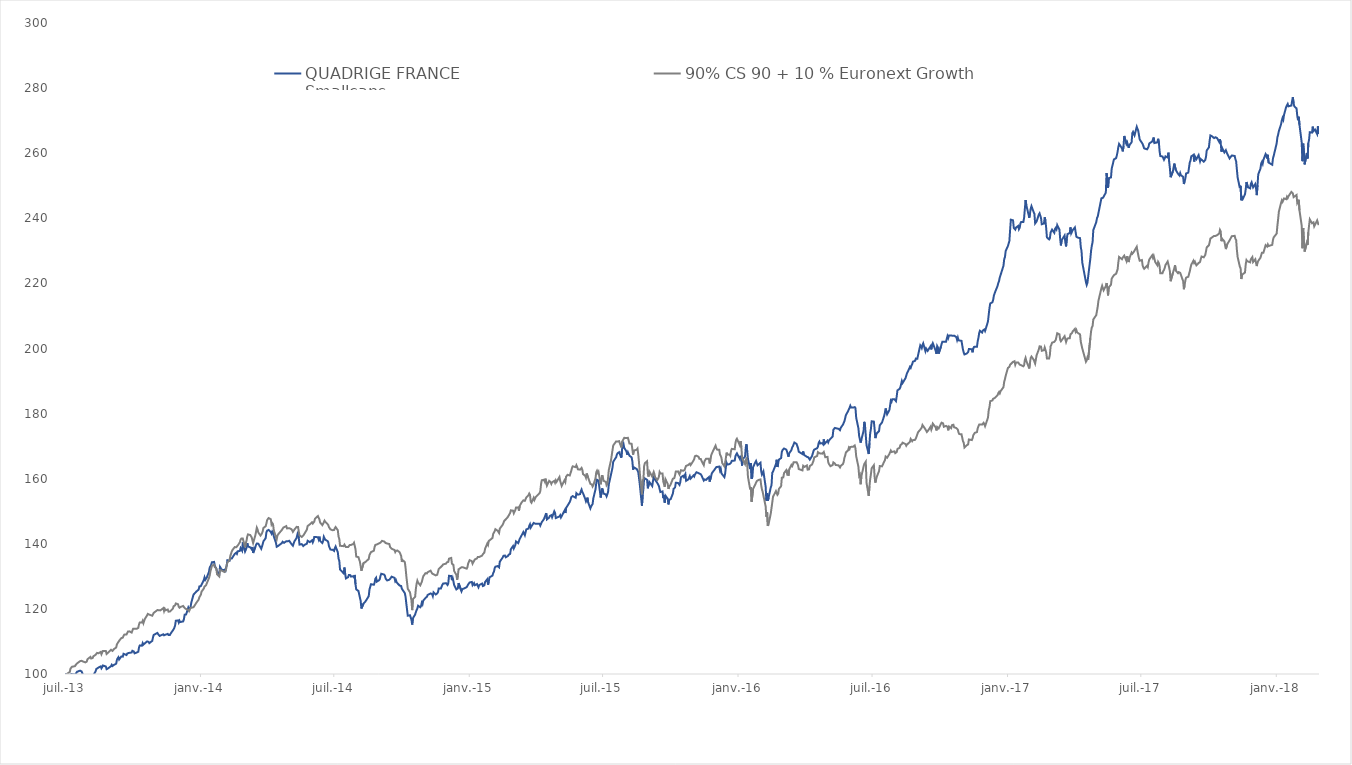
| Category |  QUADRIGE FRANCE
Smallcaps  |  90% CS 90 + 10 % Euronext Growth  |
|---|---|---|
| 2013-07-02 | 100 | 100 |
| 2013-07-03 | 100 | 99.527 |
| 2013-07-04 | 100 | 100.004 |
| 2013-07-05 | 100 | 100.1 |
| 2013-07-08 | 99.67 | 100.628 |
| 2013-07-09 | 99.74 | 101.683 |
| 2013-07-10 | 99.98 | 101.883 |
| 2013-07-11 | 100.09 | 102.224 |
| 2013-07-12 | 99.94 | 102.246 |
| 2013-07-15 | 99.78 | 102.405 |
| 2013-07-16 | 100.08 | 102.771 |
| 2013-07-17 | 100.35 | 102.888 |
| 2013-07-18 | 100.7 | 103.278 |
| 2013-07-19 | 100.81 | 103.387 |
| 2013-07-22 | 101.04 | 103.96 |
| 2013-07-23 | 101.19 | 104.056 |
| 2013-07-24 | 100.8 | 104.05 |
| 2013-07-25 | 100.83 | 104.173 |
| 2013-07-26 | 99.68 | 103.847 |
| 2013-07-29 | 99.56 | 103.564 |
| 2013-07-30 | 99.83 | 103.442 |
| 2013-07-31 | 99.26 | 103.801 |
| 2013-08-01 | 99.45 | 104.529 |
| 2013-08-02 | 99.39 | 104.623 |
| 2013-08-05 | 99.5 | 105.255 |
| 2013-08-06 | 99.4 | 104.771 |
| 2013-08-07 | 99.12 | 104.736 |
| 2013-08-08 | 98.98 | 104.891 |
| 2013-08-09 | 99.61 | 105.426 |
| 2013-08-12 | 100.8 | 105.894 |
| 2013-08-13 | 101.54 | 106.092 |
| 2013-08-14 | 101.75 | 106.475 |
| 2013-08-16 | 101.98 | 106.371 |
| 2013-08-19 | 102.33 | 106.782 |
| 2013-08-20 | 101.74 | 106.075 |
| 2013-08-21 | 102.09 | 106.605 |
| 2013-08-22 | 102.61 | 107.067 |
| 2013-08-23 | 102.81 | 107.349 |
| 2013-08-26 | 102.3 | 107.048 |
| 2013-08-27 | 101.48 | 106.151 |
| 2013-08-28 | 101.39 | 105.879 |
| 2013-08-29 | 101.72 | 106.578 |
| 2013-08-30 | 101.7 | 106.776 |
| 2013-09-02 | 102.41 | 107.444 |
| 2013-09-03 | 102.83 | 107.382 |
| 2013-09-04 | 102.46 | 107.085 |
| 2013-09-05 | 102.72 | 107.311 |
| 2013-09-06 | 102.81 | 107.668 |
| 2013-09-09 | 103.16 | 108.131 |
| 2013-09-10 | 104.36 | 109.126 |
| 2013-09-11 | 104.83 | 109.481 |
| 2013-09-12 | 105.15 | 109.827 |
| 2013-09-13 | 104.45 | 110.193 |
| 2013-09-16 | 105.38 | 111.035 |
| 2013-09-17 | 105.23 | 110.846 |
| 2013-09-18 | 105.34 | 111.174 |
| 2013-09-19 | 106.21 | 111.726 |
| 2013-09-20 | 105.95 | 112.093 |
| 2013-09-23 | 105.83 | 112.144 |
| 2013-09-24 | 106.29 | 112.562 |
| 2013-09-25 | 106.21 | 113.041 |
| 2013-09-26 | 106.46 | 113.1 |
| 2013-09-27 | 106.7 | 113.104 |
| 2013-09-30 | 106.61 | 112.725 |
| 2013-10-01 | 107.13 | 113.304 |
| 2013-10-02 | 107.23 | 113.89 |
| 2013-10-03 | 106.89 | 113.608 |
| 2013-10-04 | 106.34 | 113.881 |
| 2013-10-07 | 106.61 | 113.903 |
| 2013-10-08 | 106.82 | 114.006 |
| 2013-10-09 | 106.82 | 114.184 |
| 2013-10-10 | 108.14 | 115.227 |
| 2013-10-11 | 108.77 | 115.833 |
| 2013-10-14 | 108.69 | 115.819 |
| 2013-10-15 | 109.49 | 116.344 |
| 2013-10-16 | 109.03 | 115.609 |
| 2013-10-17 | 109.01 | 115.806 |
| 2013-10-18 | 109.44 | 116.935 |
| 2013-10-21 | 110 | 118.017 |
| 2013-10-22 | 110.22 | 118.472 |
| 2013-10-23 | 109.88 | 118.165 |
| 2013-10-24 | 109.48 | 118.242 |
| 2013-10-25 | 109.65 | 117.959 |
| 2013-10-28 | 110.18 | 117.906 |
| 2013-10-29 | 111.28 | 118.328 |
| 2013-10-30 | 112.02 | 118.784 |
| 2013-10-31 | 111.98 | 119.022 |
| 2013-11-04 | 112.61 | 119.649 |
| 2013-11-05 | 112.24 | 119.43 |
| 2013-11-06 | 111.99 | 119.592 |
| 2013-11-07 | 111.7 | 119.546 |
| 2013-11-08 | 111.74 | 119.543 |
| 2013-11-12 | 112.2 | 120.237 |
| 2013-11-13 | 111.89 | 119.335 |
| 2013-11-14 | 112.02 | 120.009 |
| 2013-11-15 | 112.09 | 119.57 |
| 2013-11-18 | 112.32 | 119.813 |
| 2013-11-19 | 112 | 119.162 |
| 2013-11-20 | 111.97 | 119.176 |
| 2013-11-21 | 112 | 119.167 |
| 2013-11-22 | 112.43 | 119.356 |
| 2013-11-25 | 113.4 | 120.084 |
| 2013-11-26 | 113.76 | 120.815 |
| 2013-11-27 | 114.2 | 121.044 |
| 2013-11-28 | 114.88 | 121.092 |
| 2013-11-29 | 116.37 | 121.682 |
| 2013-12-02 | 116.46 | 121.428 |
| 2013-12-03 | 115.8 | 120.673 |
| 2013-12-04 | 116.37 | 120.357 |
| 2013-12-05 | 115.96 | 120.342 |
| 2013-12-06 | 116.15 | 120.66 |
| 2013-12-09 | 116.16 | 120.896 |
| 2013-12-10 | 116.87 | 120.567 |
| 2013-12-11 | 118.23 | 120.748 |
| 2013-12-12 | 118.23 | 120.07 |
| 2013-12-13 | 118.3 | 119.882 |
| 2013-12-16 | 120.47 | 119.69 |
| 2013-12-17 | 120.06 | 119.312 |
| 2013-12-18 | 119.84 | 119.494 |
| 2013-12-19 | 120.56 | 120.291 |
| 2013-12-20 | 121.89 | 120.04 |
| 2013-12-23 | 124.37 | 120.505 |
| 2013-12-24 | 124.56 | 120.859 |
| 2013-12-27 | 125.37 | 121.916 |
| 2013-12-30 | 125.92 | 122.861 |
| 2013-12-31 | 126.91 | 123.603 |
| 2014-01-02 | 127 | 124.378 |
| 2014-01-03 | 127.26 | 125.33 |
| 2014-01-06 | 128.88 | 126.251 |
| 2014-01-07 | 129.67 | 126.884 |
| 2014-01-08 | 128.93 | 127.039 |
| 2014-01-09 | 129.09 | 127.242 |
| 2014-01-10 | 129.63 | 127.808 |
| 2014-01-13 | 131.38 | 129.474 |
| 2014-01-14 | 132.66 | 130.226 |
| 2014-01-15 | 132.93 | 131.512 |
| 2014-01-16 | 133.53 | 132.321 |
| 2014-01-17 | 134.32 | 133.272 |
| 2014-01-20 | 134.44 | 133.576 |
| 2014-01-21 | 133.15 | 132.816 |
| 2014-01-22 | 132.79 | 132.885 |
| 2014-01-23 | 132.38 | 132.404 |
| 2014-01-24 | 131.42 | 130.631 |
| 2014-01-27 | 130.61 | 129.953 |
| 2014-01-28 | 132.93 | 131.928 |
| 2014-01-29 | 132.57 | 131.798 |
| 2014-01-30 | 132.01 | 131.79 |
| 2014-01-31 | 131.77 | 131.547 |
| 2014-02-03 | 131.97 | 131.33 |
| 2014-02-04 | 131.28 | 131.173 |
| 2014-02-05 | 132.53 | 131.834 |
| 2014-02-06 | 133.2 | 133.315 |
| 2014-02-07 | 134.96 | 134.232 |
| 2014-02-10 | 134.79 | 135.02 |
| 2014-02-11 | 135.55 | 136.265 |
| 2014-02-12 | 135.58 | 136.399 |
| 2014-02-13 | 135.47 | 137.64 |
| 2014-02-14 | 135.67 | 138.118 |
| 2014-02-17 | 136.89 | 138.988 |
| 2014-02-18 | 137.09 | 138.7 |
| 2014-02-19 | 137.25 | 138.939 |
| 2014-02-20 | 136.92 | 138.859 |
| 2014-02-21 | 137.69 | 139.438 |
| 2014-02-24 | 137.83 | 140.465 |
| 2014-02-25 | 138.68 | 141.287 |
| 2014-02-26 | 138.42 | 141.6 |
| 2014-02-27 | 137.88 | 141.374 |
| 2014-02-28 | 140.44 | 141.595 |
| 2014-03-03 | 137.61 | 138.936 |
| 2014-03-04 | 138.09 | 140.19 |
| 2014-03-05 | 138.78 | 140.935 |
| 2014-03-06 | 140.2 | 142.266 |
| 2014-03-07 | 139.17 | 142.879 |
| 2014-03-10 | 138.93 | 142.706 |
| 2014-03-11 | 138.7 | 142.936 |
| 2014-03-12 | 138.37 | 141.994 |
| 2014-03-13 | 139.03 | 141.804 |
| 2014-03-14 | 137.19 | 140.234 |
| 2014-03-17 | 139.01 | 142.599 |
| 2014-03-18 | 139.71 | 143.774 |
| 2014-03-19 | 140.08 | 144.962 |
| 2014-03-20 | 140.14 | 144.431 |
| 2014-03-21 | 140.04 | 143.493 |
| 2014-03-24 | 138.89 | 142.536 |
| 2014-03-25 | 138.46 | 142.492 |
| 2014-03-26 | 139.12 | 143.212 |
| 2014-03-27 | 139 | 143.849 |
| 2014-03-28 | 140.77 | 144.879 |
| 2014-03-31 | 141.74 | 145.404 |
| 2014-04-01 | 143.45 | 146.243 |
| 2014-04-02 | 144.05 | 147.28 |
| 2014-04-03 | 143.95 | 147.496 |
| 2014-04-04 | 144.27 | 147.919 |
| 2014-04-07 | 143.59 | 147.542 |
| 2014-04-08 | 143.12 | 145.966 |
| 2014-04-09 | 143.8 | 146.369 |
| 2014-04-10 | 143.48 | 146.036 |
| 2014-04-11 | 142.36 | 144.221 |
| 2014-04-14 | 140.31 | 141.997 |
| 2014-04-15 | 139.09 | 141.357 |
| 2014-04-16 | 138.81 | 142.5 |
| 2014-04-17 | 139.35 | 142.916 |
| 2014-04-22 | 140.22 | 144.247 |
| 2014-04-23 | 140.63 | 144.265 |
| 2014-04-24 | 140.87 | 144.972 |
| 2014-04-25 | 140.3 | 144.818 |
| 2014-04-28 | 140.78 | 145.447 |
| 2014-04-29 | 140.83 | 144.717 |
| 2014-04-30 | 140.75 | 144.645 |
| 2014-05-02 | 140.93 | 144.804 |
| 2014-05-05 | 139.94 | 144.468 |
| 2014-05-06 | 139.7 | 144.15 |
| 2014-05-07 | 139.41 | 143.667 |
| 2014-05-09 | 140.72 | 144.364 |
| 2014-05-12 | 141.79 | 145.202 |
| 2014-05-13 | 142.78 | 145.326 |
| 2014-05-14 | 143.69 | 145.184 |
| 2014-05-15 | 141.7 | 143.748 |
| 2014-05-16 | 139.75 | 142.606 |
| 2014-05-19 | 139.9 | 142.115 |
| 2014-05-20 | 139.76 | 142.279 |
| 2014-05-21 | 139.31 | 142.523 |
| 2014-05-22 | 139.17 | 142.857 |
| 2014-05-23 | 139.7 | 143.067 |
| 2014-05-26 | 140.03 | 144.367 |
| 2014-05-27 | 140.93 | 145.451 |
| 2014-05-28 | 141.18 | 145.463 |
| 2014-05-30 | 140.51 | 145.98 |
| 2014-06-02 | 141.07 | 146.598 |
| 2014-06-03 | 140.43 | 146.227 |
| 2014-06-04 | 140.98 | 146.379 |
| 2014-06-05 | 142.07 | 146.808 |
| 2014-06-06 | 142.32 | 147.696 |
| 2014-06-10 | 142.04 | 148.539 |
| 2014-06-11 | 141.36 | 147.966 |
| 2014-06-12 | 142.19 | 147.531 |
| 2014-06-13 | 140.87 | 146.544 |
| 2014-06-16 | 140.25 | 145.721 |
| 2014-06-17 | 140.87 | 146.158 |
| 2014-06-18 | 142.16 | 146.407 |
| 2014-06-19 | 142.23 | 147.105 |
| 2014-06-20 | 141.23 | 146.734 |
| 2014-06-23 | 140.87 | 146.07 |
| 2014-06-24 | 140.52 | 145.763 |
| 2014-06-25 | 139.28 | 145.107 |
| 2014-06-26 | 138.72 | 144.924 |
| 2014-06-27 | 138.22 | 144.443 |
| 2014-06-30 | 138.18 | 144.169 |
| 2014-07-01 | 138.07 | 143.88 |
| 2014-07-02 | 137.81 | 144.256 |
| 2014-07-03 | 138.7 | 144.831 |
| 2014-07-04 | 139.18 | 145.152 |
| 2014-07-07 | 137.41 | 144.176 |
| 2014-07-08 | 135.44 | 142.186 |
| 2014-07-09 | 134.8 | 141.55 |
| 2014-07-10 | 132.11 | 139.402 |
| 2014-07-11 | 131.95 | 139.599 |
| 2014-07-15 | 130.92 | 139.268 |
| 2014-07-16 | 132.71 | 139.754 |
| 2014-07-17 | 130.82 | 139.495 |
| 2014-07-18 | 129.37 | 139.004 |
| 2014-07-21 | 129.75 | 139.001 |
| 2014-07-22 | 130.42 | 138.811 |
| 2014-07-23 | 130.53 | 139.602 |
| 2014-07-24 | 130.37 | 139.893 |
| 2014-07-25 | 129.92 | 139.662 |
| 2014-07-28 | 130.03 | 139.943 |
| 2014-07-29 | 129.7 | 140.322 |
| 2014-07-30 | 130.44 | 140.303 |
| 2014-07-31 | 127.62 | 138.374 |
| 2014-08-01 | 126 | 136.084 |
| 2014-08-04 | 125.51 | 135.897 |
| 2014-08-05 | 125.48 | 135.807 |
| 2014-08-06 | 123.47 | 134.489 |
| 2014-08-07 | 122.55 | 133.157 |
| 2014-08-08 | 120.12 | 131.711 |
| 2014-08-11 | 121.68 | 134.119 |
| 2014-08-12 | 121.89 | 134.178 |
| 2014-08-13 | 122.14 | 134.317 |
| 2014-08-14 | 122.45 | 134.482 |
| 2014-08-18 | 123.92 | 135.333 |
| 2014-08-19 | 125.96 | 136.566 |
| 2014-08-20 | 126.09 | 136.657 |
| 2014-08-21 | 127.58 | 137.429 |
| 2014-08-22 | 127.35 | 137.256 |
| 2014-08-25 | 127.42 | 137.884 |
| 2014-08-26 | 128.09 | 139.063 |
| 2014-08-27 | 129.28 | 139.655 |
| 2014-08-28 | 129.59 | 139.831 |
| 2014-08-29 | 128.39 | 139.794 |
| 2014-09-01 | 128.8 | 140.125 |
| 2014-09-02 | 129.16 | 140.238 |
| 2014-09-03 | 130.17 | 140.373 |
| 2014-09-04 | 130.8 | 140.554 |
| 2014-09-05 | 130.96 | 140.905 |
| 2014-09-08 | 130.53 | 140.697 |
| 2014-09-09 | 130.16 | 140.489 |
| 2014-09-10 | 129.28 | 140.239 |
| 2014-09-11 | 129.34 | 140.323 |
| 2014-09-12 | 128.74 | 140.086 |
| 2014-09-15 | 128.97 | 139.929 |
| 2014-09-16 | 128.74 | 138.987 |
| 2014-09-17 | 129.52 | 138.783 |
| 2014-09-18 | 129.9 | 138.505 |
| 2014-09-19 | 129.87 | 138.322 |
| 2014-09-22 | 129.54 | 138.085 |
| 2014-09-23 | 128.5 | 137.459 |
| 2014-09-24 | 128.82 | 137.854 |
| 2014-09-25 | 128.11 | 137.771 |
| 2014-09-26 | 128.02 | 137.93 |
| 2014-09-29 | 127.16 | 137.38 |
| 2014-09-30 | 127.36 | 137.223 |
| 2014-10-01 | 127.04 | 136.295 |
| 2014-10-02 | 126.18 | 134.444 |
| 2014-10-03 | 126.16 | 134.994 |
| 2014-10-06 | 124.83 | 134.371 |
| 2014-10-07 | 123.7 | 132.651 |
| 2014-10-08 | 121.69 | 130.174 |
| 2014-10-09 | 121.57 | 130.154 |
| 2014-10-10 | 117.91 | 126.181 |
| 2014-10-13 | 118.05 | 125.103 |
| 2014-10-14 | 117.97 | 124.87 |
| 2014-10-15 | 116.66 | 122.617 |
| 2014-10-16 | 115.18 | 119.626 |
| 2014-10-17 | 117.12 | 122.996 |
| 2014-10-20 | 118.28 | 123.73 |
| 2014-10-21 | 119.01 | 126.178 |
| 2014-10-22 | 119.63 | 127.734 |
| 2014-10-23 | 120.11 | 128.668 |
| 2014-10-24 | 120.98 | 128.11 |
| 2014-10-27 | 120.5 | 127.252 |
| 2014-10-28 | 120.86 | 127.294 |
| 2014-10-29 | 121.87 | 128.268 |
| 2014-10-30 | 121.43 | 128.483 |
| 2014-10-31 | 122.54 | 129.994 |
| 2014-11-03 | 123.33 | 130.981 |
| 2014-11-04 | 123.43 | 131.003 |
| 2014-11-05 | 123.74 | 130.9 |
| 2014-11-06 | 124.27 | 131.26 |
| 2014-11-07 | 124.16 | 131.253 |
| 2014-11-10 | 124.76 | 131.752 |
| 2014-11-12 | 124.53 | 130.893 |
| 2014-11-13 | 123.92 | 130.849 |
| 2014-11-14 | 125.07 | 130.624 |
| 2014-11-17 | 124.42 | 130.295 |
| 2014-11-18 | 124.47 | 130.276 |
| 2014-11-19 | 124.76 | 130.477 |
| 2014-11-20 | 125.15 | 130.734 |
| 2014-11-21 | 126.24 | 132.222 |
| 2014-11-24 | 126.27 | 132.884 |
| 2014-11-25 | 126.88 | 132.773 |
| 2014-11-26 | 127.4 | 133.325 |
| 2014-11-27 | 127.78 | 133.663 |
| 2014-11-28 | 127.86 | 133.76 |
| 2014-12-01 | 127.9 | 133.908 |
| 2014-12-02 | 127.72 | 134.289 |
| 2014-12-03 | 127.35 | 134.184 |
| 2014-12-04 | 127.87 | 134.448 |
| 2014-12-05 | 130.16 | 135.438 |
| 2014-12-08 | 130.12 | 135.665 |
| 2014-12-09 | 128.83 | 133.912 |
| 2014-12-10 | 129.47 | 133.852 |
| 2014-12-11 | 128.5 | 133.469 |
| 2014-12-12 | 127.31 | 131.639 |
| 2014-12-15 | 125.98 | 130.432 |
| 2014-12-16 | 125.98 | 128.95 |
| 2014-12-17 | 126.31 | 130.141 |
| 2014-12-18 | 127.93 | 132.154 |
| 2014-12-19 | 127.66 | 132.327 |
| 2014-12-22 | 125.41 | 132.795 |
| 2014-12-23 | 126.03 | 132.734 |
| 2014-12-24 | 126.24 | 132.77 |
| 2014-12-29 | 126.67 | 132.359 |
| 2014-12-30 | 126.95 | 132.796 |
| 2014-12-31 | 127.51 | 133.923 |
| 2015-01-02 | 128.12 | 134.971 |
| 2015-01-05 | 128.28 | 134.662 |
| 2015-01-06 | 127.3 | 133.895 |
| 2015-01-07 | 127.05 | 133.904 |
| 2015-01-08 | 127.91 | 134.745 |
| 2015-01-09 | 127.28 | 135.196 |
| 2015-01-12 | 127.63 | 135.518 |
| 2015-01-13 | 127.61 | 135.955 |
| 2015-01-14 | 126.65 | 135.882 |
| 2015-01-15 | 127.31 | 135.92 |
| 2015-01-16 | 127.4 | 135.827 |
| 2015-01-19 | 127.79 | 136.379 |
| 2015-01-20 | 127.03 | 136.814 |
| 2015-01-21 | 126.76 | 136.685 |
| 2015-01-22 | 127.25 | 137.328 |
| 2015-01-23 | 128.26 | 138.482 |
| 2015-01-26 | 129.13 | 140.089 |
| 2015-01-27 | 127.43 | 139.66 |
| 2015-01-28 | 128.41 | 140.852 |
| 2015-01-29 | 129.69 | 140.879 |
| 2015-01-30 | 129.65 | 141.246 |
| 2015-02-02 | 130.22 | 141.764 |
| 2015-02-03 | 130.98 | 143.033 |
| 2015-02-04 | 131.42 | 143.282 |
| 2015-02-05 | 132.47 | 143.848 |
| 2015-02-06 | 132.96 | 144.488 |
| 2015-02-09 | 133.16 | 144.009 |
| 2015-02-10 | 133.15 | 144.164 |
| 2015-02-11 | 132.76 | 143.314 |
| 2015-02-12 | 134.48 | 144.674 |
| 2015-02-13 | 134.59 | 144.905 |
| 2015-02-16 | 135.83 | 145.867 |
| 2015-02-17 | 136.31 | 146.061 |
| 2015-02-18 | 136.3 | 147.046 |
| 2015-02-19 | 136.39 | 147.201 |
| 2015-02-20 | 135.87 | 147.485 |
| 2015-02-23 | 136.23 | 148.257 |
| 2015-02-24 | 136.67 | 148.668 |
| 2015-02-25 | 136.6 | 148.88 |
| 2015-02-26 | 136.89 | 149.475 |
| 2015-02-27 | 138.32 | 150.278 |
| 2015-03-02 | 139.31 | 150.175 |
| 2015-03-03 | 138.57 | 149.383 |
| 2015-03-04 | 138.62 | 149.417 |
| 2015-03-05 | 139.57 | 150.343 |
| 2015-03-06 | 140.73 | 151.15 |
| 2015-03-09 | 140.19 | 151.167 |
| 2015-03-10 | 140.04 | 150.188 |
| 2015-03-11 | 141.5 | 151.613 |
| 2015-03-12 | 141.62 | 151.592 |
| 2015-03-13 | 142.32 | 152.509 |
| 2015-03-16 | 143.63 | 153.358 |
| 2015-03-17 | 143.41 | 153.17 |
| 2015-03-18 | 142.64 | 153.197 |
| 2015-03-19 | 142.85 | 153.435 |
| 2015-03-20 | 144.43 | 154.251 |
| 2015-03-23 | 144.68 | 154.954 |
| 2015-03-24 | 145.52 | 155.439 |
| 2015-03-25 | 145.99 | 155.031 |
| 2015-03-26 | 144.99 | 152.942 |
| 2015-03-27 | 145.39 | 152.627 |
| 2015-03-30 | 146.42 | 154.131 |
| 2015-03-31 | 146.15 | 153.466 |
| 2015-04-01 | 146.19 | 153.688 |
| 2015-04-02 | 146.27 | 154.445 |
| 2015-04-07 | 146.19 | 155.576 |
| 2015-04-08 | 145.61 | 156.183 |
| 2015-04-09 | 145.53 | 158.334 |
| 2015-04-10 | 146.65 | 159.523 |
| 2015-04-13 | 147.63 | 159.675 |
| 2015-04-14 | 147.66 | 159.167 |
| 2015-04-15 | 148.82 | 160.027 |
| 2015-04-16 | 149.41 | 160.011 |
| 2015-04-17 | 147.49 | 157.908 |
| 2015-04-20 | 148.05 | 159.341 |
| 2015-04-21 | 148.57 | 159.454 |
| 2015-04-22 | 148.74 | 158.948 |
| 2015-04-23 | 148.79 | 158.407 |
| 2015-04-24 | 148.14 | 158.891 |
| 2015-04-27 | 150 | 159.334 |
| 2015-04-28 | 149.54 | 158.772 |
| 2015-04-29 | 147.91 | 159.474 |
| 2015-04-30 | 147.85 | 159.018 |
| 2015-05-04 | 148.41 | 160.519 |
| 2015-05-05 | 148.77 | 159.313 |
| 2015-05-06 | 148.07 | 158.552 |
| 2015-05-07 | 147.9 | 157.759 |
| 2015-05-11 | 150.26 | 159.557 |
| 2015-05-12 | 149.45 | 159.016 |
| 2015-05-13 | 151.01 | 160.612 |
| 2015-05-15 | 151.72 | 161.2 |
| 2015-05-18 | 152.85 | 160.983 |
| 2015-05-19 | 153.46 | 161.706 |
| 2015-05-20 | 154.31 | 162.403 |
| 2015-05-21 | 154.6 | 163.292 |
| 2015-05-22 | 154.65 | 163.801 |
| 2015-05-26 | 154.15 | 163.548 |
| 2015-05-27 | 155.57 | 164.147 |
| 2015-05-28 | 155.53 | 163.657 |
| 2015-05-29 | 155.09 | 162.897 |
| 2015-06-01 | 155.27 | 162.772 |
| 2015-06-02 | 156.13 | 162.927 |
| 2015-06-03 | 156.66 | 163.314 |
| 2015-06-04 | 155.93 | 162.843 |
| 2015-06-05 | 155.56 | 161.417 |
| 2015-06-08 | 153.79 | 160.882 |
| 2015-06-09 | 153.03 | 160.292 |
| 2015-06-10 | 153.57 | 161.607 |
| 2015-06-11 | 154.18 | 161.719 |
| 2015-06-12 | 152.71 | 160.3 |
| 2015-06-15 | 150.87 | 158.411 |
| 2015-06-16 | 151.5 | 158.42 |
| 2015-06-17 | 151.79 | 158.228 |
| 2015-06-18 | 152.22 | 157.595 |
| 2015-06-19 | 153.97 | 157.971 |
| 2015-06-22 | 156.78 | 160.193 |
| 2015-06-23 | 158.72 | 161.994 |
| 2015-06-24 | 159.68 | 162.43 |
| 2015-06-25 | 159.53 | 161.794 |
| 2015-06-26 | 159.43 | 162.169 |
| 2015-06-29 | 154.21 | 158.285 |
| 2015-06-30 | 153.98 | 158.454 |
| 2015-07-01 | 157 | 161.087 |
| 2015-07-02 | 156.35 | 160.283 |
| 2015-07-03 | 155.42 | 159.343 |
| 2015-07-06 | 155.15 | 158.987 |
| 2015-07-07 | 154.58 | 157.972 |
| 2015-07-08 | 154.46 | 158.285 |
| 2015-07-09 | 155.88 | 160.231 |
| 2015-07-10 | 158.22 | 162.647 |
| 2015-07-13 | 161.3 | 165.682 |
| 2015-07-15 | 163.35 | 168.702 |
| 2015-07-16 | 165.22 | 170.187 |
| 2015-07-17 | 165.23 | 170.527 |
| 2015-07-20 | 166.59 | 171.457 |
| 2015-07-21 | 167.44 | 171.546 |
| 2015-07-22 | 167.82 | 171.408 |
| 2015-07-23 | 167.69 | 171.245 |
| 2015-07-24 | 168.13 | 171.545 |
| 2015-07-27 | 166.46 | 169.631 |
| 2015-07-28 | 169.05 | 171.302 |
| 2015-07-29 | 170.03 | 171.739 |
| 2015-07-30 | 170.66 | 172.158 |
| 2015-07-31 | 169.45 | 172.561 |
| 2015-08-03 | 168.4 | 172.467 |
| 2015-08-04 | 167.36 | 172.2 |
| 2015-08-05 | 168.11 | 172.564 |
| 2015-08-06 | 167.84 | 172.346 |
| 2015-08-07 | 167.07 | 170.822 |
| 2015-08-10 | 166.57 | 170.728 |
| 2015-08-11 | 165.34 | 170.483 |
| 2015-08-12 | 162.79 | 167.392 |
| 2015-08-13 | 163.51 | 168.652 |
| 2015-08-14 | 163.34 | 168.926 |
| 2015-08-17 | 162.96 | 168.909 |
| 2015-08-18 | 162.68 | 169.245 |
| 2015-08-19 | 162.02 | 167.458 |
| 2015-08-20 | 160.33 | 165.055 |
| 2015-08-21 | 158.48 | 162.02 |
| 2015-08-24 | 151.71 | 155.217 |
| 2015-08-25 | 154.92 | 159.529 |
| 2015-08-26 | 156.86 | 159.927 |
| 2015-08-27 | 160.22 | 163.877 |
| 2015-08-28 | 160.04 | 164.77 |
| 2015-08-31 | 159.65 | 165.366 |
| 2015-09-01 | 157.05 | 161.573 |
| 2015-09-02 | 156.96 | 160.653 |
| 2015-09-03 | 159.02 | 162.242 |
| 2015-09-07 | 157.74 | 160.653 |
| 2015-09-08 | 159.28 | 161.395 |
| 2015-09-09 | 160.38 | 162.054 |
| 2015-09-10 | 160.04 | 161.373 |
| 2015-09-11 | 159.65 | 160.423 |
| 2015-09-14 | 158.62 | 159.651 |
| 2015-09-15 | 158.24 | 160.02 |
| 2015-09-16 | 157.8 | 160.595 |
| 2015-09-17 | 157.5 | 162.043 |
| 2015-09-18 | 155.91 | 161.601 |
| 2015-09-21 | 156.09 | 161.57 |
| 2015-09-22 | 154.03 | 159.109 |
| 2015-09-23 | 154.92 | 159.179 |
| 2015-09-24 | 152.65 | 157.52 |
| 2015-09-25 | 154.78 | 159.821 |
| 2015-09-28 | 153.86 | 158.384 |
| 2015-09-29 | 152.1 | 156.89 |
| 2015-09-30 | 153.52 | 157.534 |
| 2015-10-01 | 153.28 | 157.849 |
| 2015-10-02 | 153.71 | 158.228 |
| 2015-10-05 | 155.42 | 159.993 |
| 2015-10-06 | 156.89 | 160.049 |
| 2015-10-07 | 157.19 | 160.181 |
| 2015-10-08 | 157.31 | 161.095 |
| 2015-10-09 | 158.75 | 162.234 |
| 2015-10-12 | 158.7 | 162.249 |
| 2015-10-13 | 158.45 | 161.77 |
| 2015-10-14 | 158.09 | 161.294 |
| 2015-10-15 | 158.81 | 161.915 |
| 2015-10-16 | 160.45 | 162.614 |
| 2015-10-19 | 160.89 | 162.425 |
| 2015-10-20 | 160.5 | 162.261 |
| 2015-10-21 | 160.79 | 162.7 |
| 2015-10-22 | 161.44 | 163.389 |
| 2015-10-23 | 159.35 | 163.941 |
| 2015-10-26 | 159.77 | 164.218 |
| 2015-10-27 | 159.52 | 163.929 |
| 2015-10-28 | 160.8 | 164.624 |
| 2015-10-29 | 160.02 | 164.172 |
| 2015-10-30 | 160.19 | 164.496 |
| 2015-11-02 | 161 | 165.554 |
| 2015-11-03 | 160.69 | 166.026 |
| 2015-11-04 | 161.27 | 166.924 |
| 2015-11-05 | 161.12 | 166.93 |
| 2015-11-06 | 161.98 | 167.08 |
| 2015-11-09 | 161.71 | 166.705 |
| 2015-11-10 | 161.53 | 166.122 |
| 2015-11-12 | 161.35 | 166.042 |
| 2015-11-13 | 160.93 | 165.434 |
| 2015-11-16 | 159.45 | 164.167 |
| 2015-11-17 | 159.78 | 165.379 |
| 2015-11-18 | 159.85 | 165.331 |
| 2015-11-19 | 159.64 | 166.11 |
| 2015-11-20 | 159.52 | 166.236 |
| 2015-11-23 | 160.52 | 166.094 |
| 2015-11-24 | 159.11 | 164.68 |
| 2015-11-25 | 159.15 | 165.555 |
| 2015-11-26 | 160.77 | 167.108 |
| 2015-11-27 | 161.71 | 167.762 |
| 2015-11-30 | 162.59 | 169.171 |
| 2015-12-01 | 162.91 | 169.706 |
| 2015-12-02 | 162.87 | 170.145 |
| 2015-12-03 | 163.56 | 169.414 |
| 2015-12-04 | 163.52 | 168.938 |
| 2015-12-07 | 163.73 | 168.899 |
| 2015-12-08 | 162.56 | 167.433 |
| 2015-12-09 | 163.08 | 167.016 |
| 2015-12-10 | 161.63 | 166.392 |
| 2015-12-11 | 161.74 | 164.845 |
| 2015-12-14 | 160.48 | 163.781 |
| 2015-12-15 | 161.55 | 164.881 |
| 2015-12-16 | 163.54 | 166.384 |
| 2015-12-17 | 164.88 | 168.005 |
| 2015-12-18 | 164.33 | 167.381 |
| 2015-12-21 | 164.49 | 167.467 |
| 2015-12-22 | 164.69 | 167.078 |
| 2015-12-23 | 164.91 | 168.541 |
| 2015-12-24 | 165.48 | 169.161 |
| 2015-12-28 | 165.57 | 169.035 |
| 2015-12-29 | 166.91 | 170.923 |
| 2015-12-30 | 167.44 | 171.938 |
| 2015-12-31 | 167.8 | 172.28 |
| 2016-01-04 | 166.03 | 170.2 |
| 2016-01-05 | 167.05 | 171.589 |
| 2016-01-06 | 166.14 | 169.661 |
| 2016-01-07 | 164.03 | 166.496 |
| 2016-01-08 | 166.04 | 165.824 |
| 2016-01-11 | 166.74 | 164.488 |
| 2016-01-12 | 169.6 | 165.852 |
| 2016-01-13 | 170.58 | 166.169 |
| 2016-01-14 | 168.32 | 164.287 |
| 2016-01-15 | 166.05 | 160.586 |
| 2016-01-18 | 162.93 | 156.7 |
| 2016-01-19 | 164.78 | 157.443 |
| 2016-01-20 | 159.99 | 152.9 |
| 2016-01-21 | 160.65 | 153.171 |
| 2016-01-22 | 163.58 | 156.876 |
| 2016-01-25 | 165.02 | 158.276 |
| 2016-01-26 | 165.44 | 158.365 |
| 2016-01-27 | 165.3 | 159.278 |
| 2016-01-28 | 164.13 | 158.995 |
| 2016-01-29 | 164.03 | 159.572 |
| 2016-02-01 | 164.92 | 159.781 |
| 2016-02-02 | 162.25 | 157.906 |
| 2016-02-03 | 161.26 | 156.72 |
| 2016-02-04 | 161.69 | 155.93 |
| 2016-02-05 | 162.2 | 155.715 |
| 2016-02-08 | 157.57 | 151.493 |
| 2016-02-09 | 153.25 | 148.302 |
| 2016-02-10 | 155.57 | 149.705 |
| 2016-02-11 | 153.21 | 145.511 |
| 2016-02-12 | 154.17 | 146.039 |
| 2016-02-15 | 157.38 | 149.347 |
| 2016-02-16 | 157.99 | 149.122 |
| 2016-02-17 | 161.8 | 152.679 |
| 2016-02-18 | 162.17 | 154.425 |
| 2016-02-19 | 162.2 | 154.544 |
| 2016-02-22 | 164.49 | 156.203 |
| 2016-02-23 | 165.83 | 156.299 |
| 2016-02-24 | 163.6 | 155.043 |
| 2016-02-25 | 164.69 | 155.365 |
| 2016-02-26 | 165.87 | 156.864 |
| 2016-02-29 | 166.33 | 157.693 |
| 2016-03-01 | 168.27 | 160.305 |
| 2016-03-02 | 168.8 | 160.411 |
| 2016-03-03 | 168.97 | 160.408 |
| 2016-03-04 | 169.29 | 161.721 |
| 2016-03-07 | 168.95 | 162.611 |
| 2016-03-08 | 168.38 | 161.696 |
| 2016-03-09 | 167.55 | 162.149 |
| 2016-03-10 | 166.75 | 160.9 |
| 2016-03-11 | 167.82 | 162.835 |
| 2016-03-14 | 168.78 | 164.211 |
| 2016-03-15 | 169.59 | 163.864 |
| 2016-03-16 | 169.97 | 164.326 |
| 2016-03-17 | 169.72 | 165.053 |
| 2016-03-18 | 171.11 | 165.334 |
| 2016-03-21 | 170.69 | 165.074 |
| 2016-03-22 | 170.77 | 164.769 |
| 2016-03-23 | 169.38 | 164.152 |
| 2016-03-24 | 168.28 | 162.974 |
| 2016-03-29 | 167.58 | 162.548 |
| 2016-03-30 | 168.38 | 163.986 |
| 2016-03-31 | 167.35 | 163.805 |
| 2016-04-01 | 167.14 | 163.635 |
| 2016-04-04 | 166.72 | 164.074 |
| 2016-04-05 | 166.67 | 162.781 |
| 2016-04-06 | 166.57 | 162.9 |
| 2016-04-07 | 166.17 | 162.872 |
| 2016-04-08 | 165.86 | 163.896 |
| 2016-04-11 | 166.96 | 164.359 |
| 2016-04-12 | 167.18 | 164.257 |
| 2016-04-13 | 168.48 | 165.499 |
| 2016-04-14 | 168.95 | 166.551 |
| 2016-04-15 | 169.15 | 166.739 |
| 2016-04-18 | 169.36 | 167.012 |
| 2016-04-19 | 169.82 | 168.167 |
| 2016-04-20 | 171 | 168.312 |
| 2016-04-21 | 171.4 | 167.811 |
| 2016-04-22 | 170.83 | 167.52 |
| 2016-04-25 | 170.91 | 167.693 |
| 2016-04-26 | 170.6 | 167.777 |
| 2016-04-27 | 172.07 | 168.222 |
| 2016-04-28 | 170.69 | 168.023 |
| 2016-04-29 | 170.71 | 166.608 |
| 2016-05-02 | 171.68 | 166.699 |
| 2016-05-03 | 171.15 | 165.083 |
| 2016-05-04 | 171.73 | 164.497 |
| 2016-05-06 | 172.25 | 163.844 |
| 2016-05-09 | 172.97 | 164.179 |
| 2016-05-10 | 175.03 | 165.007 |
| 2016-05-11 | 175.22 | 165.065 |
| 2016-05-12 | 175.6 | 164.667 |
| 2016-05-13 | 175.86 | 164.213 |
| 2016-05-17 | 175.31 | 164.099 |
| 2016-05-18 | 175.1 | 164.097 |
| 2016-05-19 | 174.91 | 163.463 |
| 2016-05-20 | 175.64 | 163.944 |
| 2016-05-23 | 176.61 | 164.503 |
| 2016-05-24 | 176.77 | 165.138 |
| 2016-05-25 | 177.68 | 166.417 |
| 2016-05-26 | 178.59 | 167.08 |
| 2016-05-27 | 179.53 | 168.053 |
| 2016-05-30 | 180.78 | 168.726 |
| 2016-05-31 | 181.31 | 169.515 |
| 2016-06-01 | 181.79 | 169.137 |
| 2016-06-02 | 182.4 | 169.762 |
| 2016-06-03 | 181.84 | 169.866 |
| 2016-06-06 | 181.84 | 169.816 |
| 2016-06-07 | 181.84 | 170.109 |
| 2016-06-08 | 182 | 170.217 |
| 2016-06-09 | 181.67 | 169.293 |
| 2016-06-10 | 178.73 | 166.897 |
| 2016-06-13 | 175.49 | 163.647 |
| 2016-06-14 | 173.12 | 160.885 |
| 2016-06-15 | 173.3 | 161.252 |
| 2016-06-16 | 171.09 | 158.296 |
| 2016-06-17 | 172.02 | 160.688 |
| 2016-06-20 | 174.65 | 163.721 |
| 2016-06-21 | 177.47 | 164.539 |
| 2016-06-22 | 176.26 | 164.429 |
| 2016-06-23 | 176.54 | 165.222 |
| 2016-06-24 | 170.3 | 158.796 |
| 2016-06-27 | 167.57 | 154.711 |
| 2016-06-28 | 170.86 | 157.644 |
| 2016-06-29 | 173.98 | 159.895 |
| 2016-06-30 | 175.34 | 161.419 |
| 2016-07-01 | 177.63 | 163.201 |
| 2016-07-04 | 177.55 | 164.143 |
| 2016-07-05 | 175.18 | 160.57 |
| 2016-07-06 | 172.47 | 158.805 |
| 2016-07-07 | 173.32 | 159.741 |
| 2016-07-08 | 173.95 | 160.647 |
| 2016-07-11 | 174.61 | 162.325 |
| 2016-07-12 | 176.39 | 163.899 |
| 2016-07-13 | 176.63 | 163.983 |
| 2016-07-15 | 177.26 | 163.793 |
| 2016-07-18 | 179.31 | 165.235 |
| 2016-07-19 | 180.32 | 165.706 |
| 2016-07-20 | 181.57 | 166.816 |
| 2016-07-21 | 181.4 | 166.703 |
| 2016-07-22 | 179.79 | 166.442 |
| 2016-07-25 | 181.04 | 167.569 |
| 2016-07-26 | 182.41 | 167.324 |
| 2016-07-27 | 183.98 | 168.648 |
| 2016-07-28 | 183.66 | 168.197 |
| 2016-07-29 | 184.42 | 167.988 |
| 2016-08-01 | 184.42 | 168.396 |
| 2016-08-02 | 184.32 | 167.85 |
| 2016-08-03 | 183.83 | 167.945 |
| 2016-08-04 | 185.25 | 168.184 |
| 2016-08-05 | 187.13 | 169.128 |
| 2016-08-08 | 187.63 | 169.51 |
| 2016-08-09 | 188.11 | 170.335 |
| 2016-08-10 | 188.37 | 170.239 |
| 2016-08-11 | 190.02 | 170.667 |
| 2016-08-12 | 189.4 | 171.084 |
| 2016-08-16 | 190.91 | 170.634 |
| 2016-08-17 | 190.69 | 170.141 |
| 2016-08-18 | 192.43 | 170.492 |
| 2016-08-19 | 192.82 | 170.384 |
| 2016-08-22 | 194.36 | 171.33 |
| 2016-08-23 | 194.04 | 172.211 |
| 2016-08-24 | 194.71 | 172.258 |
| 2016-08-25 | 195.16 | 171.515 |
| 2016-08-26 | 195.95 | 171.831 |
| 2016-08-29 | 196.23 | 171.943 |
| 2016-08-30 | 196.9 | 172.41 |
| 2016-08-31 | 197.02 | 172.952 |
| 2016-09-01 | 196.84 | 173.076 |
| 2016-09-02 | 197.95 | 174.287 |
| 2016-09-05 | 200.96 | 175.058 |
| 2016-09-06 | 200.6 | 175.147 |
| 2016-09-07 | 200.13 | 175.711 |
| 2016-09-08 | 201.02 | 176.507 |
| 2016-09-09 | 201.58 | 176.51 |
| 2016-09-12 | 199.17 | 175.177 |
| 2016-09-13 | 199.99 | 175.082 |
| 2016-09-14 | 199.71 | 174.35 |
| 2016-09-15 | 199.27 | 174.577 |
| 2016-09-16 | 199.43 | 174.904 |
| 2016-09-19 | 200.7 | 175.982 |
| 2016-09-20 | 199.71 | 175.07 |
| 2016-09-21 | 201.13 | 175.724 |
| 2016-09-22 | 201.64 | 176.936 |
| 2016-09-23 | 201.34 | 176.886 |
| 2016-09-26 | 199.26 | 175.75 |
| 2016-09-27 | 198.34 | 174.819 |
| 2016-09-28 | 200.71 | 175.9 |
| 2016-09-29 | 200.24 | 176.077 |
| 2016-09-30 | 198.43 | 175.448 |
| 2016-10-03 | 200.55 | 176.856 |
| 2016-10-04 | 201.43 | 177.227 |
| 2016-10-05 | 202.08 | 177.264 |
| 2016-10-06 | 201.85 | 177.004 |
| 2016-10-07 | 202.08 | 175.959 |
| 2016-10-10 | 202.06 | 176.209 |
| 2016-10-11 | 203 | 176.055 |
| 2016-10-12 | 203.83 | 175.943 |
| 2016-10-13 | 203.24 | 174.868 |
| 2016-10-14 | 204 | 176.043 |
| 2016-10-17 | 204 | 175.523 |
| 2016-10-18 | 204.14 | 176.437 |
| 2016-10-19 | 203.9 | 176.725 |
| 2016-10-20 | 204.01 | 176.573 |
| 2016-10-21 | 203.95 | 175.799 |
| 2016-10-24 | 203.49 | 175.566 |
| 2016-10-25 | 202.6 | 175.39 |
| 2016-10-26 | 203.36 | 175.089 |
| 2016-10-27 | 202.51 | 174.171 |
| 2016-10-28 | 202.21 | 173.71 |
| 2016-10-31 | 202.35 | 173.639 |
| 2016-11-02 | 199.65 | 171.518 |
| 2016-11-03 | 198.75 | 171.082 |
| 2016-11-04 | 198.17 | 169.585 |
| 2016-11-07 | 198.45 | 170.262 |
| 2016-11-08 | 198.62 | 170.143 |
| 2016-11-09 | 198.87 | 170.525 |
| 2016-11-10 | 199.83 | 172.058 |
| 2016-11-14 | 199.79 | 171.873 |
| 2016-11-15 | 198.83 | 172.352 |
| 2016-11-16 | 200.02 | 173.352 |
| 2016-11-17 | 200.5 | 173.515 |
| 2016-11-18 | 200.72 | 174.084 |
| 2016-11-21 | 200.55 | 174.327 |
| 2016-11-22 | 202.23 | 175.482 |
| 2016-11-23 | 203.25 | 176.099 |
| 2016-11-24 | 204.72 | 176.626 |
| 2016-11-25 | 205.45 | 176.447 |
| 2016-11-28 | 204.9 | 176.614 |
| 2016-11-29 | 205.52 | 176.45 |
| 2016-11-30 | 205.76 | 177.177 |
| 2016-12-01 | 205.85 | 176.763 |
| 2016-12-02 | 205.38 | 176.146 |
| 2016-12-05 | 207.58 | 178.095 |
| 2016-12-06 | 208.42 | 178.821 |
| 2016-12-07 | 210.49 | 181.158 |
| 2016-12-08 | 212.41 | 181.964 |
| 2016-12-09 | 213.83 | 183.808 |
| 2016-12-12 | 214.2 | 184.051 |
| 2016-12-13 | 214.97 | 184.564 |
| 2016-12-14 | 216.26 | 184.438 |
| 2016-12-15 | 216.96 | 184.766 |
| 2016-12-16 | 217.23 | 184.718 |
| 2016-12-19 | 219.25 | 185.69 |
| 2016-12-20 | 220.12 | 186.298 |
| 2016-12-21 | 220.73 | 186.647 |
| 2016-12-22 | 221.86 | 186.23 |
| 2016-12-23 | 222.54 | 186.865 |
| 2016-12-27 | 225.42 | 188.122 |
| 2016-12-28 | 227.44 | 189.794 |
| 2016-12-29 | 228.09 | 190.585 |
| 2016-12-30 | 229.95 | 191.626 |
| 2017-01-02 | 231.47 | 194.018 |
| 2017-01-03 | 231.43 | 194.174 |
| 2017-01-04 | 232.98 | 194.365 |
| 2017-01-05 | 236.37 | 195.015 |
| 2017-01-06 | 239.58 | 195.104 |
| 2017-01-09 | 239.36 | 195.894 |
| 2017-01-10 | 237.06 | 196.135 |
| 2017-01-11 | 236.99 | 196.091 |
| 2017-01-12 | 236.54 | 195.019 |
| 2017-01-13 | 237.16 | 195.662 |
| 2017-01-16 | 237.66 | 195.694 |
| 2017-01-17 | 236.63 | 195.526 |
| 2017-01-18 | 237.08 | 195.053 |
| 2017-01-19 | 238.44 | 195.166 |
| 2017-01-20 | 238.89 | 194.869 |
| 2017-01-23 | 238.88 | 194.523 |
| 2017-01-24 | 240.13 | 194.848 |
| 2017-01-25 | 242.81 | 196.416 |
| 2017-01-26 | 245.62 | 197.121 |
| 2017-01-27 | 244.07 | 196.175 |
| 2017-01-30 | 241.19 | 194.483 |
| 2017-01-31 | 240.16 | 193.868 |
| 2017-02-01 | 241.49 | 195.7 |
| 2017-02-02 | 242.99 | 197.108 |
| 2017-02-03 | 243.74 | 197.525 |
| 2017-02-06 | 241.89 | 196.582 |
| 2017-02-07 | 241.36 | 196.734 |
| 2017-02-08 | 238.44 | 195.371 |
| 2017-02-09 | 238.26 | 195.391 |
| 2017-02-10 | 239.04 | 197.924 |
| 2017-02-13 | 241.15 | 199.716 |
| 2017-02-14 | 241.53 | 200.672 |
| 2017-02-15 | 240.83 | 200.952 |
| 2017-02-16 | 240.08 | 200.582 |
| 2017-02-17 | 238.17 | 199.305 |
| 2017-02-20 | 238.41 | 199.485 |
| 2017-02-21 | 240.32 | 200.322 |
| 2017-02-22 | 239.31 | 200.086 |
| 2017-02-23 | 236.99 | 198.831 |
| 2017-02-24 | 234.15 | 196.944 |
| 2017-02-27 | 233.5 | 196.928 |
| 2017-02-28 | 233.83 | 198.046 |
| 2017-03-01 | 235.6 | 200.656 |
| 2017-03-02 | 235.79 | 201.165 |
| 2017-03-03 | 236.52 | 201.8 |
| 2017-03-06 | 235.55 | 202.02 |
| 2017-03-07 | 236.72 | 201.855 |
| 2017-03-08 | 237.08 | 202.66 |
| 2017-03-09 | 236.65 | 202.663 |
| 2017-03-10 | 237.92 | 204.685 |
| 2017-03-13 | 236.54 | 204.342 |
| 2017-03-14 | 233.69 | 202.653 |
| 2017-03-15 | 231.67 | 202.219 |
| 2017-03-16 | 233.28 | 202.272 |
| 2017-03-17 | 233.62 | 202.842 |
| 2017-03-20 | 234.72 | 203.768 |
| 2017-03-21 | 232.61 | 203.507 |
| 2017-03-22 | 231.37 | 202.011 |
| 2017-03-23 | 233.78 | 202.703 |
| 2017-03-24 | 235.16 | 203.094 |
| 2017-03-27 | 235.49 | 203.157 |
| 2017-03-28 | 237.22 | 204.367 |
| 2017-03-29 | 235.39 | 204.267 |
| 2017-03-30 | 235.51 | 204.74 |
| 2017-03-31 | 236.36 | 205.237 |
| 2017-04-03 | 237.2 | 206.02 |
| 2017-04-04 | 235.73 | 205.189 |
| 2017-04-05 | 234.34 | 205.669 |
| 2017-04-06 | 234.61 | 204.948 |
| 2017-04-07 | 234.06 | 204.724 |
| 2017-04-10 | 233.91 | 204.324 |
| 2017-04-11 | 231.1 | 202.069 |
| 2017-04-12 | 229.95 | 201.777 |
| 2017-04-13 | 226.43 | 200.035 |
| 2017-04-18 | 220.41 | 195.94 |
| 2017-04-19 | 219.52 | 196.346 |
| 2017-04-20 | 220.16 | 197.216 |
| 2017-04-21 | 220.14 | 196.561 |
| 2017-04-24 | 227.69 | 203.254 |
| 2017-04-25 | 230.08 | 205.307 |
| 2017-04-26 | 231.61 | 206.507 |
| 2017-04-27 | 232.63 | 206.869 |
| 2017-04-28 | 236.38 | 208.915 |
| 2017-05-02 | 238.82 | 210.249 |
| 2017-05-03 | 240.06 | 210.486 |
| 2017-05-04 | 240.51 | 212.886 |
| 2017-05-05 | 240.8 | 214.723 |
| 2017-05-09 | 246.14 | 218.54 |
| 2017-05-10 | 246.07 | 219.27 |
| 2017-05-11 | 246.28 | 218.541 |
| 2017-05-12 | 246.62 | 217.88 |
| 2017-05-15 | 247.9 | 219.198 |
| 2017-05-16 | 253.89 | 220.113 |
| 2017-05-17 | 251.77 | 218.69 |
| 2017-05-18 | 249.31 | 216.311 |
| 2017-05-19 | 252.34 | 218.75 |
| 2017-05-22 | 252.56 | 219.604 |
| 2017-05-23 | 255.28 | 221.489 |
| 2017-05-24 | 255.39 | 221.394 |
| 2017-05-26 | 258.08 | 222.515 |
| 2017-05-29 | 258.48 | 222.979 |
| 2017-05-30 | 259.36 | 223.234 |
| 2017-05-31 | 260.48 | 224.339 |
| 2017-06-01 | 261.87 | 226.507 |
| 2017-06-02 | 262.85 | 228.13 |
| 2017-06-06 | 261.46 | 227.419 |
| 2017-06-07 | 260.56 | 227.945 |
| 2017-06-08 | 262.14 | 227.817 |
| 2017-06-09 | 265.3 | 228.534 |
| 2017-06-12 | 262.84 | 226.895 |
| 2017-06-13 | 263.34 | 228.381 |
| 2017-06-14 | 263.44 | 228.386 |
| 2017-06-15 | 261.65 | 226.558 |
| 2017-06-16 | 262.5 | 227.74 |
| 2017-06-19 | 263.33 | 229.471 |
| 2017-06-20 | 266.17 | 229.104 |
| 2017-06-21 | 266.57 | 228.872 |
| 2017-06-22 | 266.42 | 229.683 |
| 2017-06-23 | 265.49 | 229.533 |
| 2017-06-26 | 268.12 | 231.261 |
| 2017-06-27 | 267.49 | 229.914 |
| 2017-06-28 | 266.91 | 229.837 |
| 2017-06-29 | 266.86 | 227.669 |
| 2017-06-30 | 264.23 | 226.976 |
| 2017-07-03 | 263.21 | 227.179 |
| 2017-07-04 | 262.8 | 225.494 |
| 2017-07-05 | 262.23 | 224.832 |
| 2017-07-06 | 261.5 | 224.491 |
| 2017-07-07 | 261.67 | 224.518 |
| 2017-07-10 | 261.19 | 225.409 |
| 2017-07-11 | 261.52 | 225.008 |
| 2017-07-12 | 261.96 | 226.427 |
| 2017-07-13 | 262.99 | 227.355 |
| 2017-07-17 | 263.61 | 228.632 |
| 2017-07-18 | 263.82 | 227.888 |
| 2017-07-19 | 264.82 | 228.454 |
| 2017-07-20 | 263.11 | 228.174 |
| 2017-07-21 | 263.4 | 226.61 |
| 2017-07-24 | 263.33 | 225.569 |
| 2017-07-25 | 264.43 | 226.618 |
| 2017-07-26 | 263.45 | 226.242 |
| 2017-07-27 | 260.66 | 225.306 |
| 2017-07-28 | 259.11 | 223.124 |
| 2017-07-31 | 259 | 223.12 |
| 2017-08-01 | 258.82 | 223.799 |
| 2017-08-02 | 257.98 | 224.122 |
| 2017-08-03 | 258.42 | 224.764 |
| 2017-08-04 | 259.04 | 225.634 |
| 2017-08-07 | 258.7 | 226.735 |
| 2017-08-08 | 260.17 | 226.755 |
| 2017-08-09 | 257.41 | 224.92 |
| 2017-08-10 | 255.39 | 223.68 |
| 2017-08-11 | 252.63 | 220.676 |
| 2017-08-14 | 254.33 | 223.125 |
| 2017-08-16 | 256.81 | 224.671 |
| 2017-08-17 | 256.59 | 225.598 |
| 2017-08-18 | 254.85 | 223.945 |
| 2017-08-21 | 253.69 | 223.138 |
| 2017-08-22 | 253.4 | 223.462 |
| 2017-08-23 | 253.16 | 223.553 |
| 2017-08-24 | 253.89 | 223.24 |
| 2017-08-25 | 253.25 | 222.615 |
| 2017-08-28 | 252.72 | 220.679 |
| 2017-08-29 | 250.53 | 218.206 |
| 2017-08-30 | 251.35 | 219.432 |
| 2017-08-31 | 252.25 | 220.921 |
| 2017-09-01 | 253.77 | 221.756 |
| 2017-09-04 | 254.04 | 222.043 |
| 2017-09-05 | 255.62 | 222.884 |
| 2017-09-06 | 257.17 | 223.71 |
| 2017-09-07 | 257.72 | 224.796 |
| 2017-09-08 | 259.03 | 225.715 |
| 2017-09-11 | 259.49 | 226.975 |
| 2017-09-12 | 257.43 | 226.294 |
| 2017-09-13 | 259.03 | 226.651 |
| 2017-09-14 | 258.54 | 226.679 |
| 2017-09-15 | 258.16 | 225.54 |
| 2017-09-18 | 259.41 | 226.263 |
| 2017-09-19 | 259.67 | 226.557 |
| 2017-09-20 | 257.5 | 226.592 |
| 2017-09-21 | 258.2 | 227.536 |
| 2017-09-22 | 258.34 | 228.258 |
| 2017-09-25 | 257.4 | 228.015 |
| 2017-09-26 | 257.11 | 227.848 |
| 2017-09-27 | 257.9 | 228.742 |
| 2017-09-28 | 258.79 | 229.803 |
| 2017-09-29 | 260.82 | 231.041 |
| 2017-10-02 | 261.8 | 231.743 |
| 2017-10-03 | 263.88 | 232.632 |
| 2017-10-04 | 265.46 | 233.787 |
| 2017-10-05 | 265.76 | 234.061 |
| 2017-10-06 | 265.24 | 234.091 |
| 2017-10-09 | 264.64 | 234.588 |
| 2017-10-10 | 264.4 | 234.36 |
| 2017-10-11 | 264.9 | 234.594 |
| 2017-10-12 | 264.86 | 234.776 |
| 2017-10-13 | 264.68 | 234.798 |
| 2017-10-16 | 263.44 | 235.327 |
| 2017-10-17 | 264.26 | 236.411 |
| 2017-10-18 | 263.26 | 235.963 |
| 2017-10-19 | 260.46 | 232.973 |
| 2017-10-20 | 261.61 | 233.695 |
| 2017-10-23 | 260.22 | 232.921 |
| 2017-10-24 | 260.58 | 233.058 |
| 2017-10-25 | 260.93 | 230.533 |
| 2017-10-26 | 260.7 | 230.342 |
| 2017-10-27 | 259.76 | 232.107 |
| 2017-10-30 | 258.39 | 233.184 |
| 2017-10-31 | 258.33 | 233.235 |
| 2017-11-02 | 259.3 | 234.489 |
| 2017-11-03 | 259.24 | 234.207 |
| 2017-11-06 | 259.15 | 234.618 |
| 2017-11-07 | 258.15 | 233.705 |
| 2017-11-08 | 257.45 | 233.296 |
| 2017-11-09 | 254.92 | 230.241 |
| 2017-11-10 | 252.55 | 228.092 |
| 2017-11-13 | 249.29 | 225.158 |
| 2017-11-14 | 250 | 224.689 |
| 2017-11-15 | 245.54 | 221.334 |
| 2017-11-16 | 246.49 | 222.652 |
| 2017-11-17 | 245.97 | 222.688 |
| 2017-11-20 | 247.36 | 223.346 |
| 2017-11-21 | 248.94 | 225.873 |
| 2017-11-22 | 251.14 | 227.166 |
| 2017-11-23 | 250.94 | 226.833 |
| 2017-11-24 | 249.52 | 227.058 |
| 2017-11-27 | 249.2 | 226.468 |
| 2017-11-28 | 250.6 | 227.437 |
| 2017-11-29 | 251.05 | 227.64 |
| 2017-11-30 | 250.82 | 228.081 |
| 2017-12-01 | 249.5 | 226.564 |
| 2017-12-04 | 250.53 | 227.4 |
| 2017-12-05 | 249.19 | 226.295 |
| 2017-12-06 | 247.12 | 225.324 |
| 2017-12-07 | 250.2 | 226.511 |
| 2017-12-08 | 253.52 | 226.895 |
| 2017-12-11 | 255.25 | 227.894 |
| 2017-12-12 | 256.92 | 228.682 |
| 2017-12-13 | 257.36 | 229.428 |
| 2017-12-14 | 256.76 | 229.502 |
| 2017-12-15 | 257.97 | 229.428 |
| 2017-12-18 | 259.75 | 231.739 |
| 2017-12-19 | 259.37 | 231.909 |
| 2017-12-20 | 258.38 | 231.32 |
| 2017-12-21 | 259.51 | 231.955 |
| 2017-12-22 | 257.14 | 231.475 |
| 2017-12-27 | 256.45 | 231.843 |
| 2017-12-28 | 258.41 | 233.402 |
| 2017-12-29 | 259.2 | 234.145 |
| 2018-01-02 | 263.03 | 235.303 |
| 2018-01-03 | 264.86 | 237.725 |
| 2018-01-04 | 265.72 | 239.76 |
| 2018-01-05 | 266.79 | 242.029 |
| 2018-01-08 | 268.91 | 244.749 |
| 2018-01-09 | 270.09 | 245.493 |
| 2018-01-10 | 270.84 | 245.053 |
| 2018-01-11 | 270.29 | 244.794 |
| 2018-01-12 | 271.78 | 246.097 |
| 2018-01-15 | 274.3 | 245.883 |
| 2018-01-16 | 274.47 | 246.611 |
| 2018-01-17 | 275.12 | 246.219 |
| 2018-01-18 | 274.4 | 246.748 |
| 2018-01-19 | 274.66 | 247.046 |
| 2018-01-22 | 274.64 | 248.117 |
| 2018-01-23 | 276.09 | 248.056 |
| 2018-01-24 | 277.2 | 247.647 |
| 2018-01-25 | 275.28 | 246.512 |
| 2018-01-26 | 274.41 | 246.424 |
| 2018-01-29 | 273.75 | 247.157 |
| 2018-01-30 | 271.44 | 244.681 |
| 2018-01-31 | 270.13 | 245.097 |
| 2018-02-01 | 271.21 | 245.71 |
| 2018-02-02 | 268.72 | 242.419 |
| 2018-02-05 | 263.31 | 237.779 |
| 2018-02-06 | 257.56 | 230.821 |
| 2018-02-07 | 262.94 | 236.978 |
| 2018-02-08 | 260.59 | 233.148 |
| 2018-02-09 | 256.56 | 229.768 |
| 2018-02-12 | 259.94 | 232.52 |
| 2018-02-13 | 258.36 | 231.794 |
| 2018-02-14 | 263.07 | 235.703 |
| 2018-02-15 | 264.14 | 237.737 |
| 2018-02-16 | 266.45 | 239.662 |
| 2018-02-19 | 266.35 | 238.475 |
| 2018-02-20 | 268.16 | 238.769 |
| 2018-02-21 | 266.8 | 238.754 |
| 2018-02-22 | 266.66 | 237.551 |
| 2018-02-23 | 267.28 | 237.768 |
| 2018-02-26 | 265.87 | 239.369 |
| 2018-02-27 | 268.27 | 239.26 |
| 2018-02-28 | 265.91 | 237.9 |